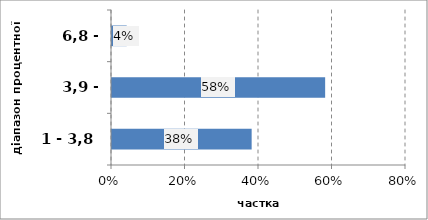
| Category | Series 0 |
|---|---|
| 1 - 3,8 | 0.38 |
| 3,9 - 6,7 | 0.58 |
| 6,8 - 9,5 | 0.04 |